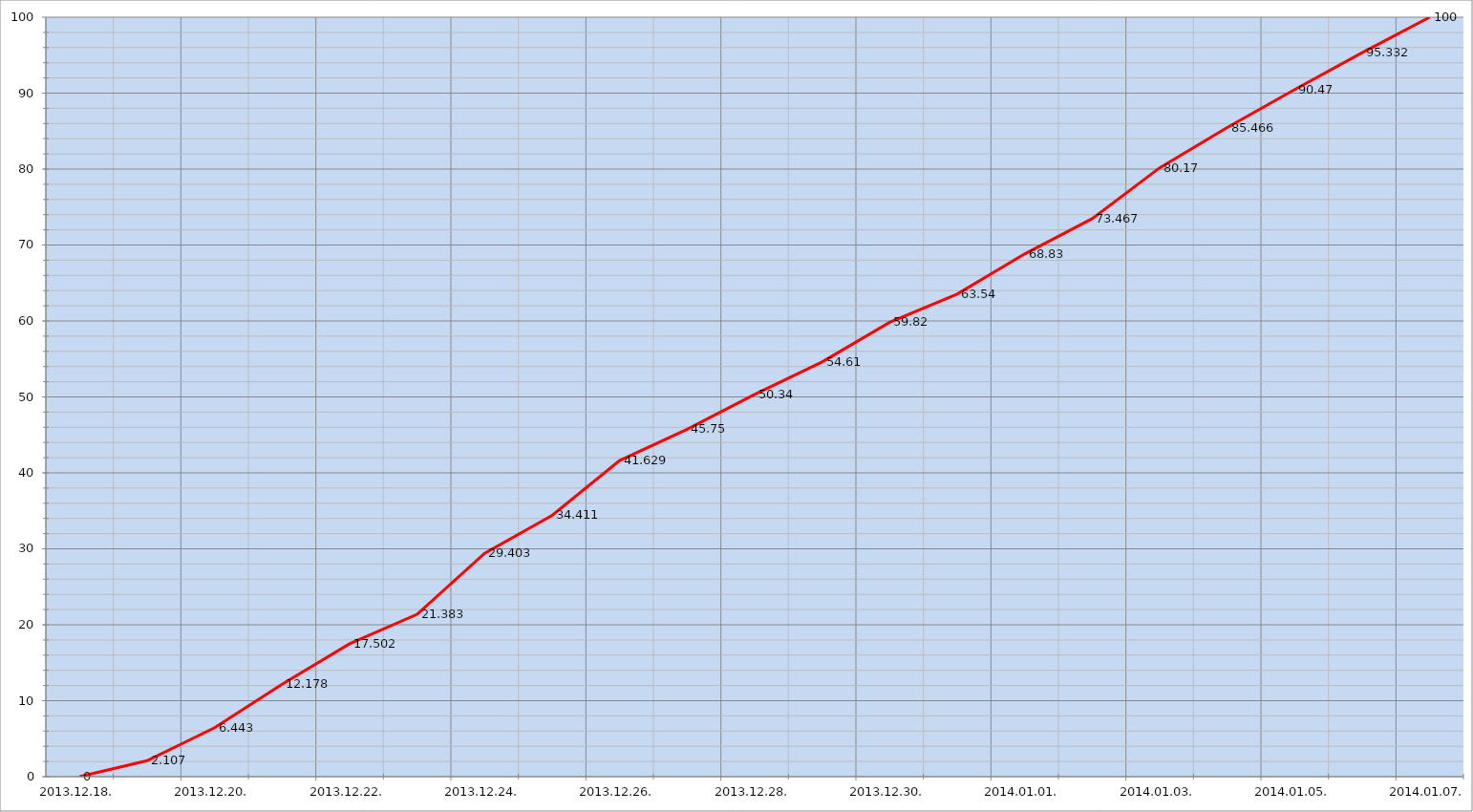
| Category | Szerver 2 |
|---|---|
| 2013-12-18 | 0 |
| 2013-12-19 | 2.107 |
| 2013-12-20 | 6.443 |
| 2013-12-21 | 12.178 |
| 2013-12-22 | 17.502 |
| 2013-12-23 | 21.383 |
| 2013-12-24 | 29.403 |
| 2013-12-25 | 34.411 |
| 2013-12-26 | 41.629 |
| 2013-12-27 | 45.75 |
| 2013-12-28 | 50.34 |
| 2013-12-29 | 54.61 |
| 2013-12-30 | 59.82 |
| 2013-12-31 | 63.54 |
| 2014-01-01 | 68.83 |
| 2014-01-02 | 73.467 |
| 2014-01-03 | 80.17 |
| 2014-01-04 | 85.466 |
| 2014-01-05 | 90.47 |
| 2014-01-06 | 95.332 |
| 2014-01-07 | 100 |